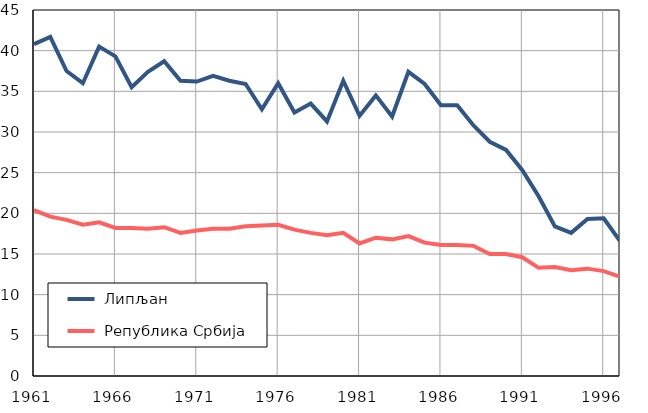
| Category |  Липљан |  Република Србија |
|---|---|---|
| 1961.0 | 40.8 | 20.4 |
| 1962.0 | 41.7 | 19.6 |
| 1963.0 | 37.5 | 19.2 |
| 1964.0 | 36 | 18.6 |
| 1965.0 | 40.5 | 18.9 |
| 1966.0 | 39.3 | 18.2 |
| 1967.0 | 35.5 | 18.2 |
| 1968.0 | 37.4 | 18.1 |
| 1969.0 | 38.7 | 18.3 |
| 1970.0 | 36.3 | 17.6 |
| 1971.0 | 36.2 | 17.9 |
| 1972.0 | 36.9 | 18.1 |
| 1973.0 | 36.3 | 18.1 |
| 1974.0 | 35.9 | 18.4 |
| 1975.0 | 32.8 | 18.5 |
| 1976.0 | 36 | 18.6 |
| 1977.0 | 32.4 | 18 |
| 1978.0 | 33.5 | 17.6 |
| 1979.0 | 31.3 | 17.3 |
| 1980.0 | 36.3 | 17.6 |
| 1981.0 | 32 | 16.3 |
| 1982.0 | 34.5 | 17 |
| 1983.0 | 31.9 | 16.8 |
| 1984.0 | 37.4 | 17.2 |
| 1985.0 | 35.9 | 16.4 |
| 1986.0 | 33.3 | 16.1 |
| 1987.0 | 33.3 | 16.1 |
| 1988.0 | 30.8 | 16 |
| 1989.0 | 28.8 | 15 |
| 1990.0 | 27.8 | 15 |
| 1991.0 | 25.3 | 14.6 |
| 1992.0 | 22.1 | 13.3 |
| 1993.0 | 18.4 | 13.4 |
| 1994.0 | 17.6 | 13 |
| 1995.0 | 19.3 | 13.2 |
| 1996.0 | 19.4 | 12.9 |
| 1997.0 | 16.6 | 12.2 |